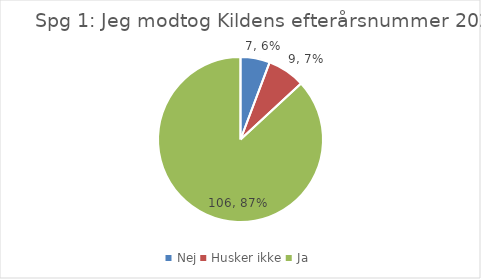
| Category | Svar |
|---|---|
| Nej | 7 |
| Husker ikke | 9 |
| Ja | 106 |